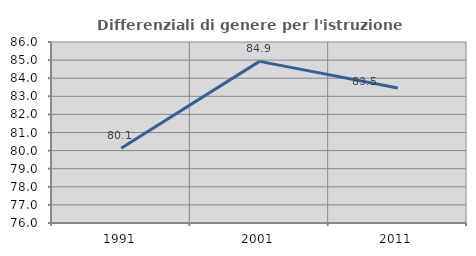
| Category | Differenziali di genere per l'istruzione superiore |
|---|---|
| 1991.0 | 80.127 |
| 2001.0 | 84.93 |
| 2011.0 | 83.453 |